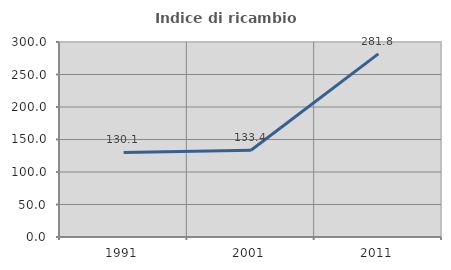
| Category | Indice di ricambio occupazionale  |
|---|---|
| 1991.0 | 130.097 |
| 2001.0 | 133.441 |
| 2011.0 | 281.771 |